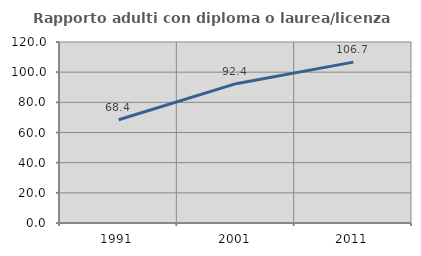
| Category | Rapporto adulti con diploma o laurea/licenza media  |
|---|---|
| 1991.0 | 68.449 |
| 2001.0 | 92.381 |
| 2011.0 | 106.667 |